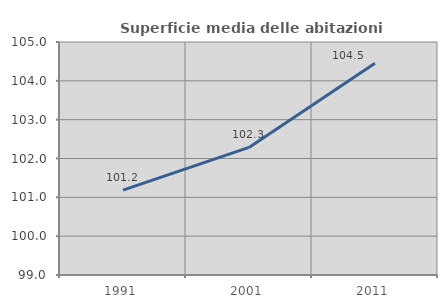
| Category | Superficie media delle abitazioni occupate |
|---|---|
| 1991.0 | 101.186 |
| 2001.0 | 102.285 |
| 2011.0 | 104.452 |